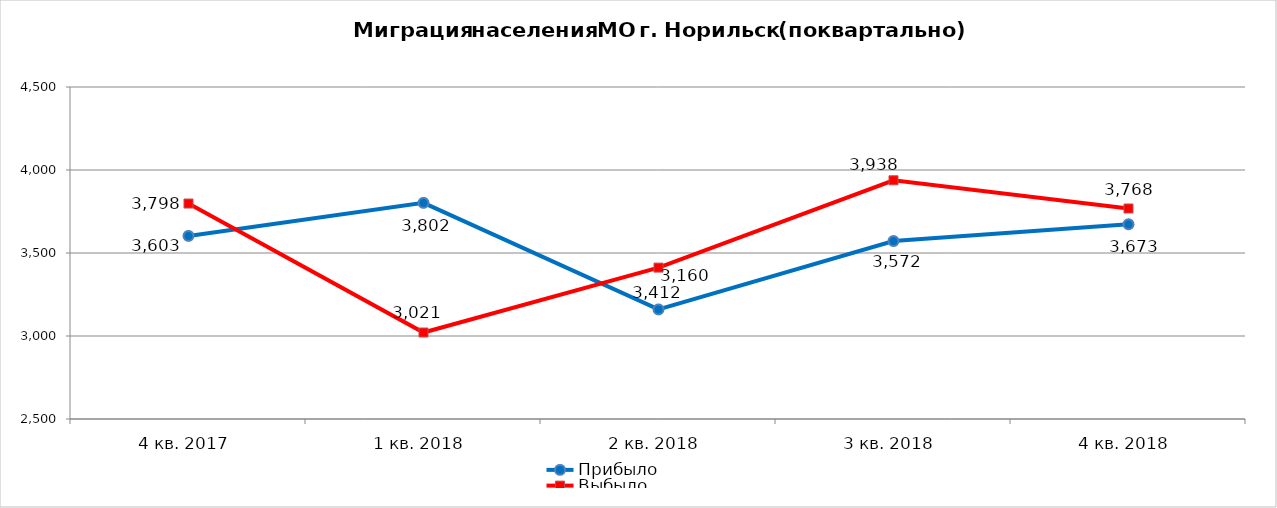
| Category | Прибыло | Выбыло |
|---|---|---|
| 4 кв. 2017 | 3603 | 3798 |
| 1 кв. 2018 | 3802 | 3021 |
| 2 кв. 2018 | 3160 | 3412 |
| 3 кв. 2018 | 3572 | 3938 |
| 4 кв. 2018 | 3673 | 3768 |